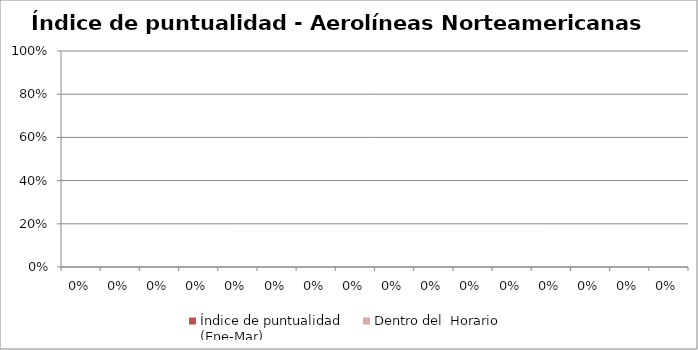
| Category | Índice de puntualidad
(Ene-Mar) | Dentro del  Horario |
|---|---|---|
| 0.0 | 0 | 0 |
| 0.0 | 0 | 0 |
| 0.0 | 0 | 0 |
| 0.0 | 0 | 0 |
| 0.0 | 0 | 0 |
| 0.0 | 0 | 0 |
| 0.0 | 0 | 0 |
| 0.0 | 0 | 0 |
| 0.0 | 0 | 0 |
| 0.0 | 0 | 0 |
| 0.0 | 0 | 0 |
| 0.0 | 0 | 0 |
| 0.0 | 0 | 0 |
| 0.0 | 0 | 0 |
| 0.0 | 0 | 0 |
| 0.0 | 0 | 0 |